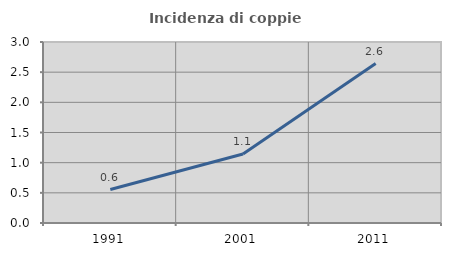
| Category | Incidenza di coppie miste |
|---|---|
| 1991.0 | 0.555 |
| 2001.0 | 1.144 |
| 2011.0 | 2.643 |